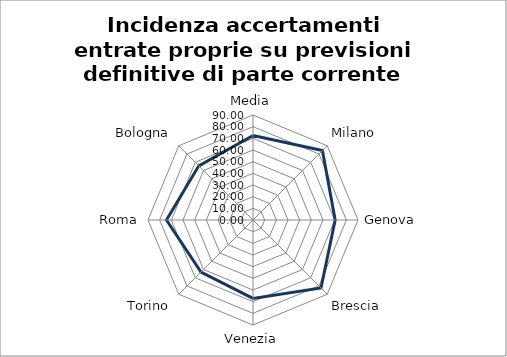
| Category | Incidenza accertamenti entrate proprie su previsioni definitive di parte corrente |
|---|---|
| Media | 72.446 |
| Milano | 84.16 |
| Genova | 70.43 |
| Brescia | 82.43 |
| Venezia | 67.18 |
| Torino | 63.08 |
| Roma | 74.16 |
| Bologna | 65.68 |